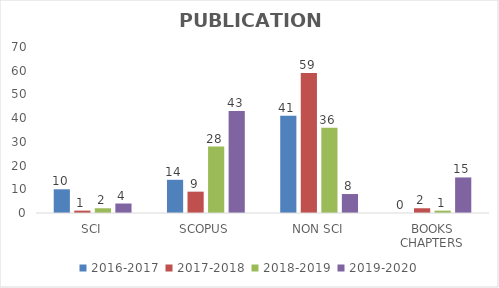
| Category | 2016-2017 | 2017-2018 | 2018-2019 | 2019-2020 |
|---|---|---|---|---|
| SCI | 10 | 1 | 2 | 4 |
| SCOPUS | 14 | 9 | 28 | 43 |
| NON SCI | 41 | 59 | 36 | 8 |
| BOOKS CHAPTERS | 0 | 2 | 1 | 15 |